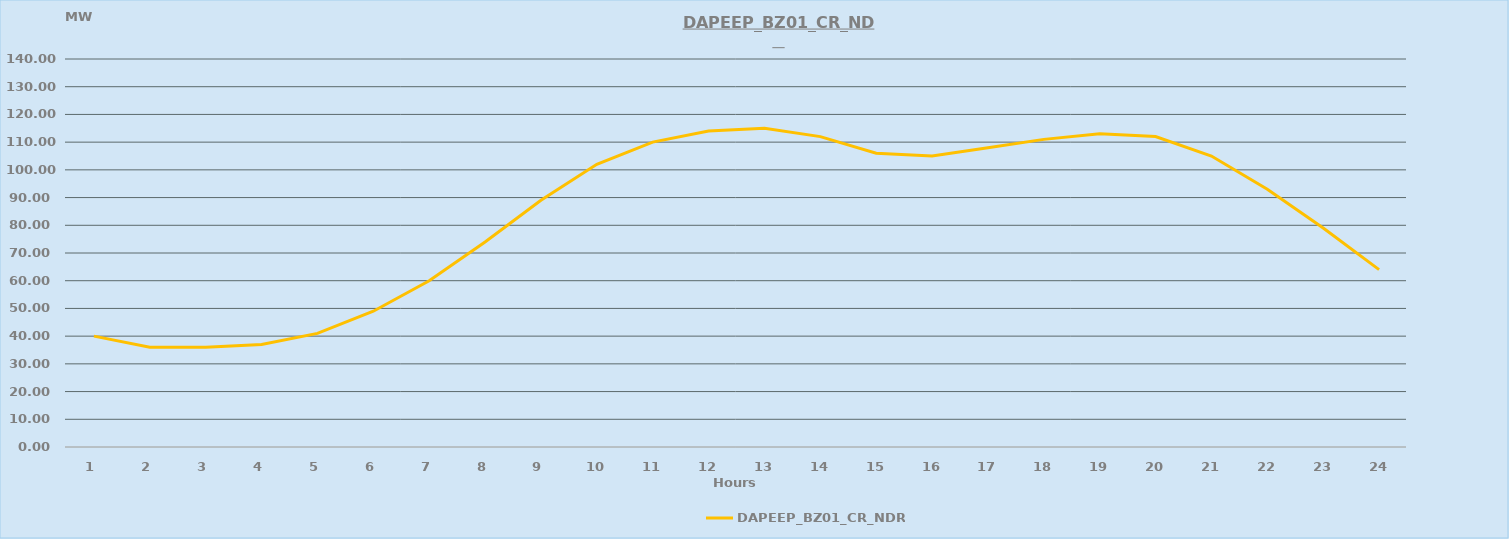
| Category | DAPEEP_BZ01_CR_NDR |
|---|---|
| 0 | 40 |
| 1 | 36 |
| 2 | 36 |
| 3 | 37 |
| 4 | 41 |
| 5 | 49 |
| 6 | 60 |
| 7 | 74 |
| 8 | 89 |
| 9 | 102 |
| 10 | 110 |
| 11 | 114 |
| 12 | 115 |
| 13 | 112 |
| 14 | 106 |
| 15 | 105 |
| 16 | 108 |
| 17 | 111 |
| 18 | 113 |
| 19 | 112 |
| 20 | 105 |
| 21 | 93 |
| 22 | 79 |
| 23 | 64 |